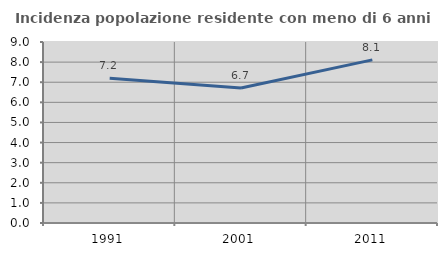
| Category | Incidenza popolazione residente con meno di 6 anni |
|---|---|
| 1991.0 | 7.192 |
| 2001.0 | 6.71 |
| 2011.0 | 8.111 |